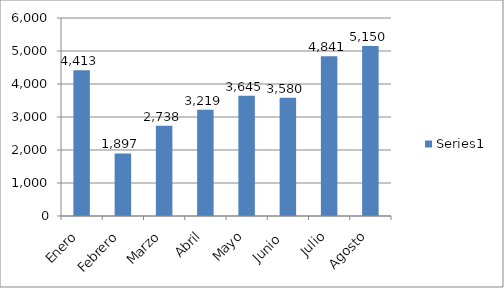
| Category | Series 0 |
|---|---|
| Enero | 4413 |
| Febrero | 1897 |
| Marzo | 2738 |
| Abril  | 3219 |
| Mayo | 3645 |
| Junio  | 3580 |
| Julio | 4841 |
| Agosto | 5150 |